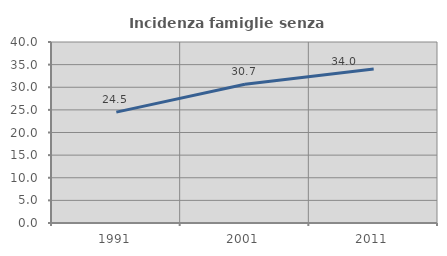
| Category | Incidenza famiglie senza nuclei |
|---|---|
| 1991.0 | 24.505 |
| 2001.0 | 30.66 |
| 2011.0 | 34.049 |